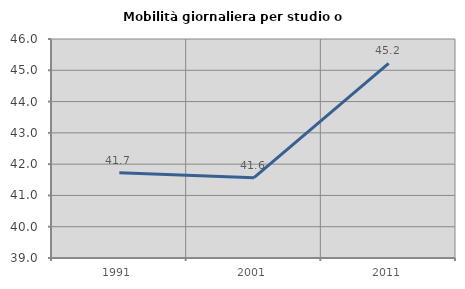
| Category | Mobilità giornaliera per studio o lavoro |
|---|---|
| 1991.0 | 41.727 |
| 2001.0 | 41.567 |
| 2011.0 | 45.223 |